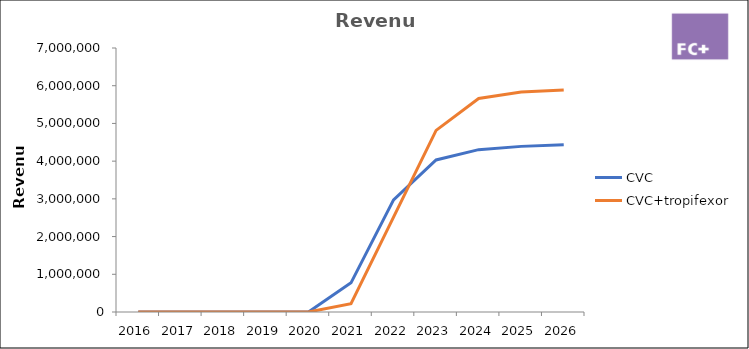
| Category | CVC | CVC+tropifexor |
|---|---|---|
| 2016.0 | 0 | 0 |
| 2017.0 | 0 | 0 |
| 2018.0 | 0 | 0 |
| 2019.0 | 0 | 0 |
| 2020.0 | 0 | 0 |
| 2021.0 | 773900.474 | 218386.698 |
| 2022.0 | 2971810.063 | 2517066.828 |
| 2023.0 | 4031014.301 | 4815790.282 |
| 2024.0 | 4304606.148 | 5662165.025 |
| 2025.0 | 4391573.541 | 5830744.246 |
| 2026.0 | 4435489.276 | 5889051.689 |